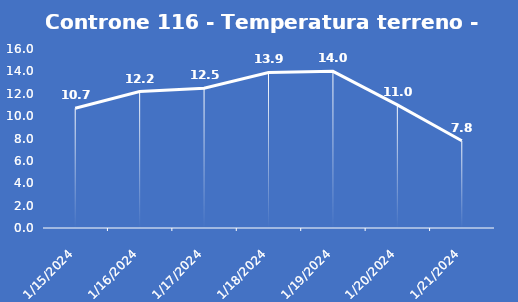
| Category | Controne 116 - Temperatura terreno - Grezzo (°C) |
|---|---|
| 1/15/24 | 10.7 |
| 1/16/24 | 12.2 |
| 1/17/24 | 12.5 |
| 1/18/24 | 13.9 |
| 1/19/24 | 14 |
| 1/20/24 | 11 |
| 1/21/24 | 7.8 |